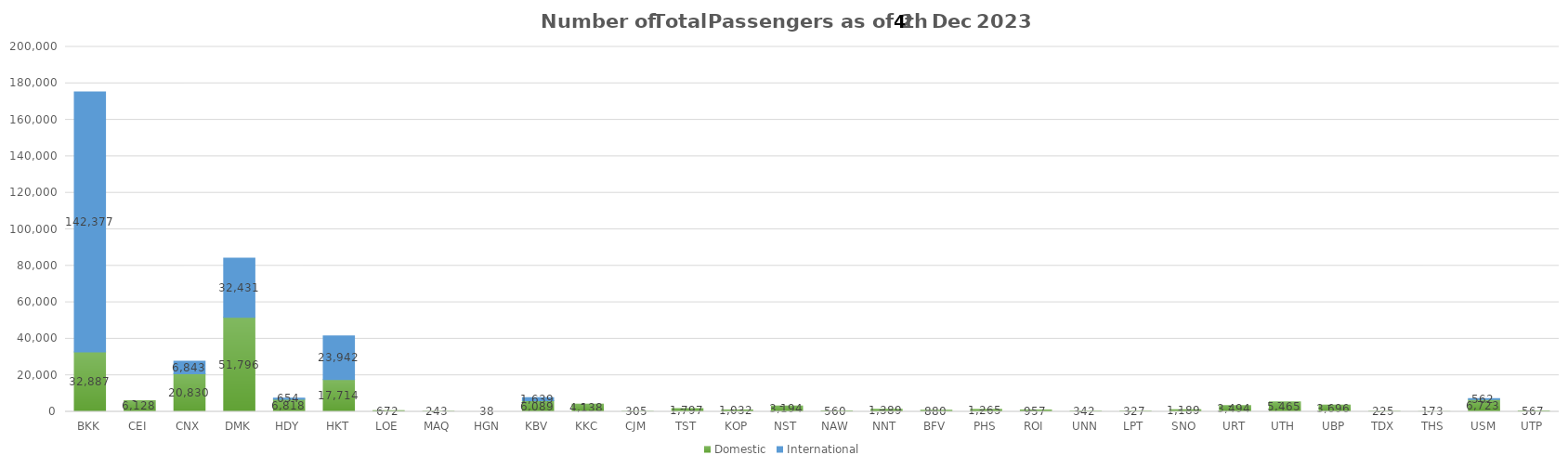
| Category | Domestic | International |
|---|---|---|
| BKK | 32887 | 142377 |
| CEI | 6128 | 0 |
| CNX | 20830 | 6843 |
| DMK | 51796 | 32431 |
| HDY | 6818 | 654 |
| HKT | 17714 | 23942 |
| LOE | 672 | 0 |
| MAQ | 243 | 0 |
| HGN | 38 | 0 |
| KBV | 6089 | 1639 |
| KKC | 4138 | 0 |
| CJM | 305 | 0 |
| TST | 1797 | 0 |
| KOP | 1032 | 0 |
| NST | 3194 | 0 |
| NAW | 560 | 0 |
| NNT | 1389 | 0 |
| BFV | 880 | 0 |
| PHS | 1265 | 0 |
| ROI | 957 | 0 |
| UNN | 342 | 0 |
| LPT | 327 | 0 |
| SNO | 1189 | 0 |
| URT | 3494 | 0 |
| UTH | 5465 | 0 |
| UBP | 3696 | 0 |
| TDX | 225 | 0 |
| THS | 173 | 0 |
| USM | 6723 | 562 |
| UTP | 567 | 0 |